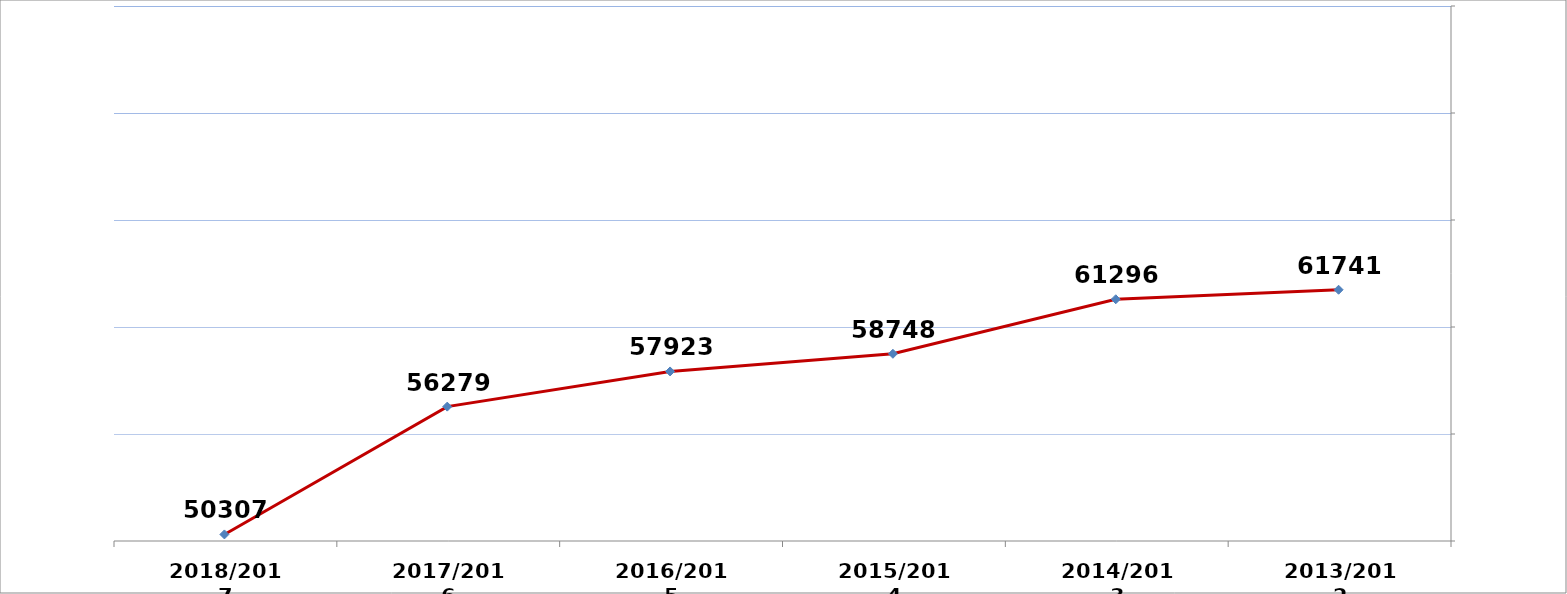
| Category | عدد الخرّيجين |
|---|---|
| 2013/2012 | 61741 |
| 2014/2013 | 61296 |
| 2015/2014 | 58748 |
| 2016/2015 | 57923 |
| 2017/2016 | 56279 |
| 2018/2017 | 50307 |